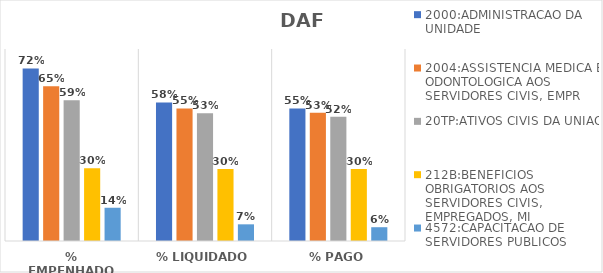
| Category | 2000:ADMINISTRACAO DA UNIDADE | 2004:ASSISTENCIA MEDICA E ODONTOLOGICA AOS SERVIDORES CIVIS, EMPR | 20TP:ATIVOS CIVIS DA UNIAO | 212B:BENEFICIOS OBRIGATORIOS AOS SERVIDORES CIVIS, EMPREGADOS, MI | 4572:CAPACITACAO DE SERVIDORES PUBLICOS FEDERAIS EM PROCESSO DE Q |
|---|---|---|---|---|---|
| % EMPENHADO | 0.719 | 0.645 | 0.587 | 0.303 | 0.139 |
| % LIQUIDADO | 0.577 | 0.552 | 0.532 | 0.3 | 0.069 |
| % PAGO | 0.553 | 0.534 | 0.518 | 0.3 | 0.057 |